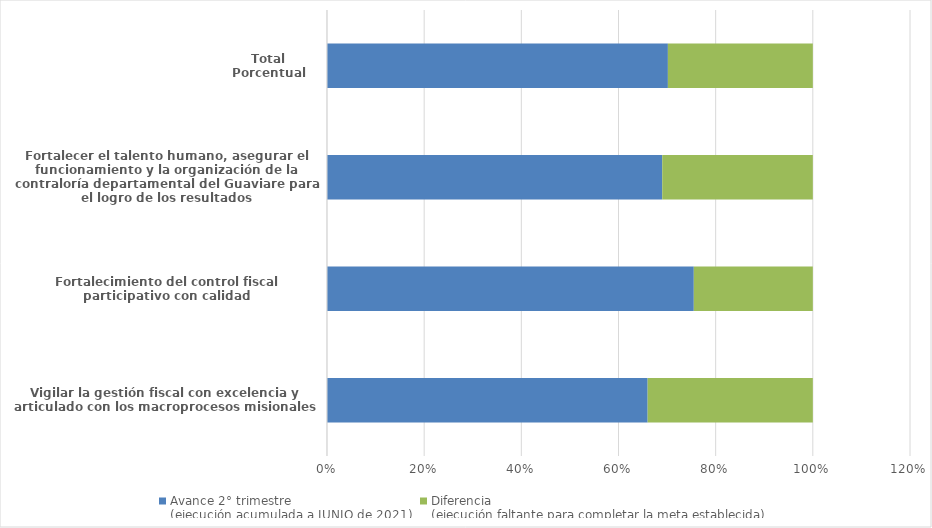
| Category | Avance 2° trimestre 
(ejecución acumulada a JUNIO de 2021) | Diferencia
(ejecución faltante para completar la meta establecida) |
|---|---|---|
| Vigilar la gestión fiscal con excelencia y articulado con los macroprocesos misionales | 0.66 | 0.34 |
| Fortalecimiento del control fiscal participativo con calidad | 0.755 | 0.245 |
| Fortalecer el talento humano, asegurar el funcionamiento y la organización de la contraloría departamental del Guaviare para el logro de los resultados | 0.69 | 0.31 |
| Total Porcentual | 0.702 | 0.298 |